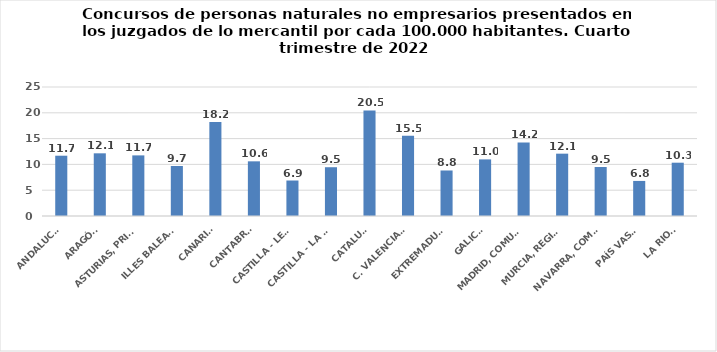
| Category | Series 0 |
|---|---|
| ANDALUCÍA | 11.683 |
| ARAGÓN | 12.148 |
| ASTURIAS, PRINCIPADO | 11.747 |
| ILLES BALEARS | 9.692 |
| CANARIAS | 18.241 |
| CANTABRIA | 10.594 |
| CASTILLA - LEÓN | 6.877 |
| CASTILLA - LA MANCHA | 9.453 |
| CATALUÑA | 20.467 |
| C. VALENCIANA | 15.538 |
| EXTREMADURA | 8.821 |
| GALICIA | 10.97 |
| MADRID, COMUNIDAD | 14.249 |
| MURCIA, REGIÓN | 12.08 |
| NAVARRA, COM. FORAL | 9.493 |
| PAÍS VASCO | 6.796 |
| LA RIOJA | 10.329 |